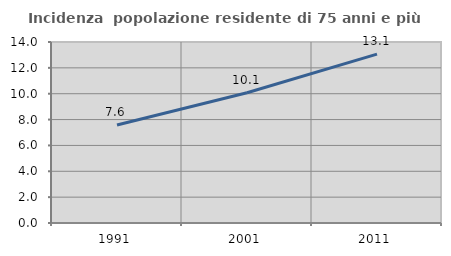
| Category | Incidenza  popolazione residente di 75 anni e più |
|---|---|
| 1991.0 | 7.585 |
| 2001.0 | 10.079 |
| 2011.0 | 13.065 |